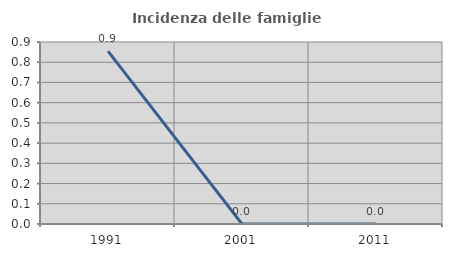
| Category | Incidenza delle famiglie numerose |
|---|---|
| 1991.0 | 0.855 |
| 2001.0 | 0 |
| 2011.0 | 0 |